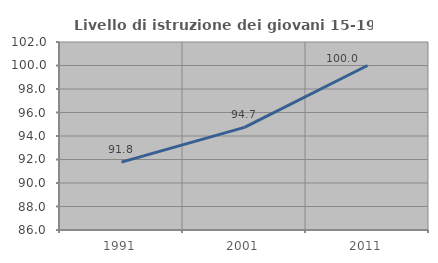
| Category | Livello di istruzione dei giovani 15-19 anni |
|---|---|
| 1991.0 | 91.781 |
| 2001.0 | 94.737 |
| 2011.0 | 100 |